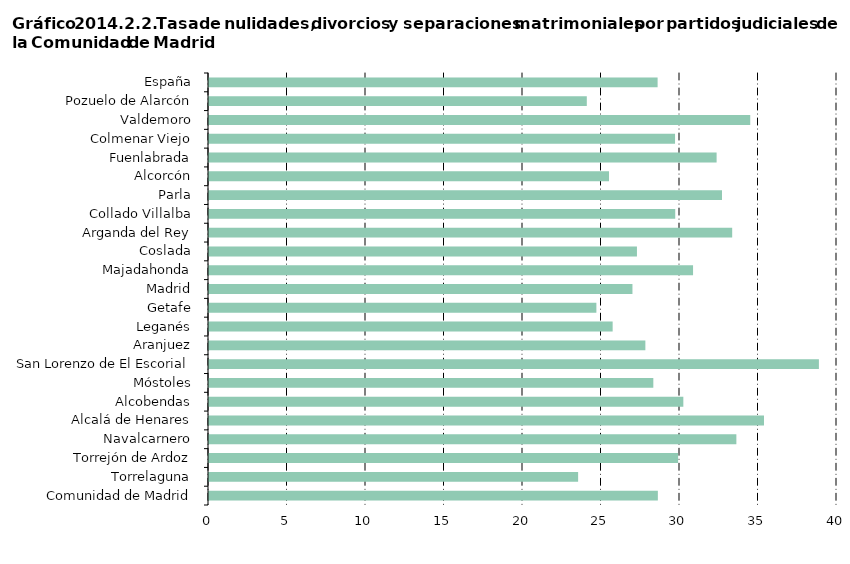
| Category | Series 0 |
|---|---|
| Comunidad de Madrid | 28.59 |
|     Torrelaguna | 23.512 |
|     Torrejón de Ardoz | 29.879 |
|     Navalcarnero | 33.59 |
|     Alcalá de Henares | 35.35 |
|     Alcobendas | 30.213 |
|     Móstoles | 28.301 |
|     San Lorenzo de El Escorial | 38.847 |
|     Aranjuez | 27.794 |
|     Leganés | 25.71 |
|     Getafe | 24.674 |
|     Madrid | 26.971 |
|     Majadahonda | 30.832 |
|     Coslada | 27.258 |
|     Arganda del Rey | 33.324 |
|     Collado Villalba | 29.696 |
|     Parla | 32.675 |
|     Alcorcón | 25.479 |
|     Fuenlabrada | 32.332 |
|     Colmenar Viejo | 29.685 |
|     Valdemoro | 34.474 |
|     Pozuelo de Alarcón | 24.064 |
| España | 28.574 |